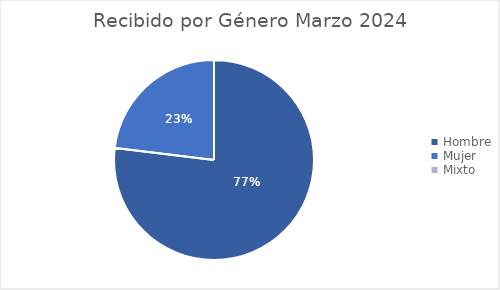
| Category | Series 0 |
|---|---|
| Hombre | 30 |
| Mujer | 9 |
| Mixto | 0 |